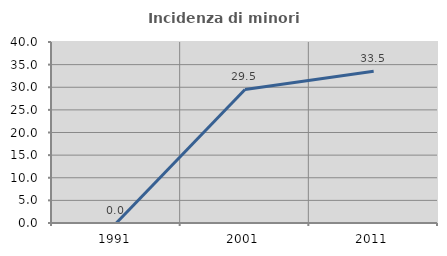
| Category | Incidenza di minori stranieri |
|---|---|
| 1991.0 | 0 |
| 2001.0 | 29.508 |
| 2011.0 | 33.526 |